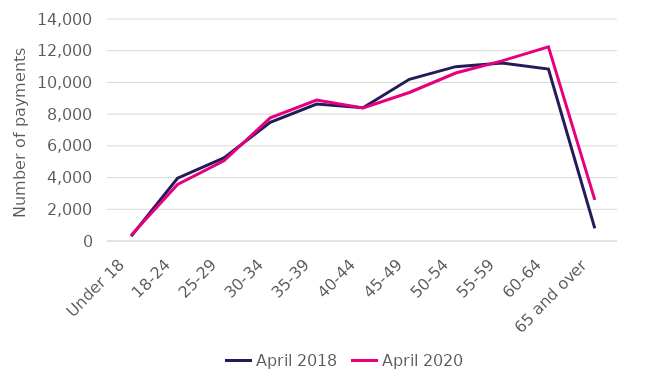
| Category | April 2018 | April 2020 |
|---|---|---|
| Under 18 | 300 | 365 |
| 18-24 | 3960 | 3565 |
| 25-29 | 5245 | 5060 |
| 30-34 | 7485 | 7765 |
| 35-39 | 8635 | 8890 |
| 40-44 | 8400 | 8385 |
| 45-49 | 10195 | 9365 |
| 50-54 | 10995 | 10595 |
| 55-59 | 11230 | 11360 |
| 60-64 | 10845 | 12240 |
| 65 and over | 795 | 2595 |